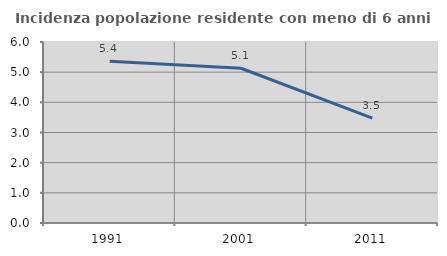
| Category | Incidenza popolazione residente con meno di 6 anni |
|---|---|
| 1991.0 | 5.36 |
| 2001.0 | 5.13 |
| 2011.0 | 3.478 |